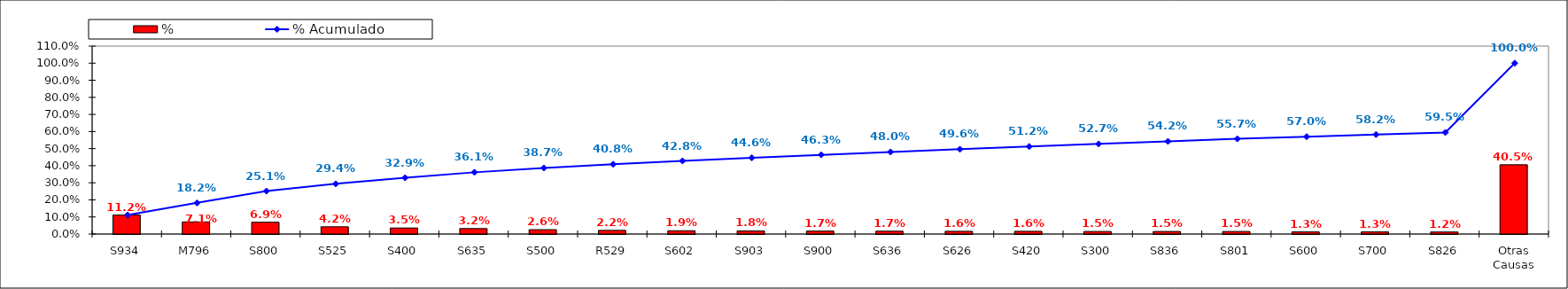
| Category | % |
|---|---|
| S934 | 0.112 |
| M796 | 0.071 |
| S800 | 0.069 |
| S525 | 0.042 |
| S400 | 0.035 |
| S635 | 0.032 |
| S500 | 0.026 |
| R529 | 0.022 |
| S602 | 0.019 |
| S903 | 0.018 |
| S900 | 0.017 |
| S636 | 0.017 |
| S626 | 0.016 |
| S420 | 0.016 |
| S300 | 0.015 |
| S836 | 0.015 |
| S801 | 0.015 |
| S600 | 0.013 |
| S700 | 0.013 |
| S826 | 0.012 |
| Otras Causas | 0.405 |